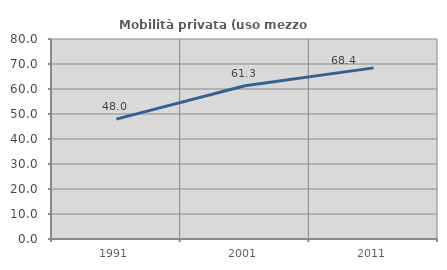
| Category | Mobilità privata (uso mezzo privato) |
|---|---|
| 1991.0 | 47.953 |
| 2001.0 | 61.32 |
| 2011.0 | 68.45 |